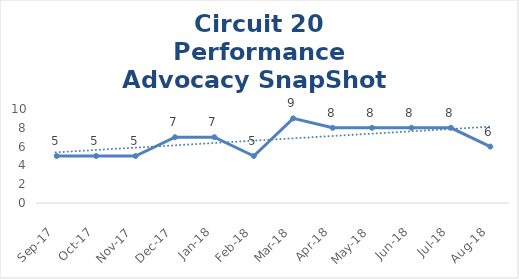
| Category | Circuit 20 |
|---|---|
| Sep-17 | 5 |
| Oct-17 | 5 |
| Nov-17 | 5 |
| Dec-17 | 7 |
| Jan-18 | 7 |
| Feb-18 | 5 |
| Mar-18 | 9 |
| Apr-18 | 8 |
| May-18 | 8 |
| Jun-18 | 8 |
| Jul-18 | 8 |
| Aug-18 | 6 |